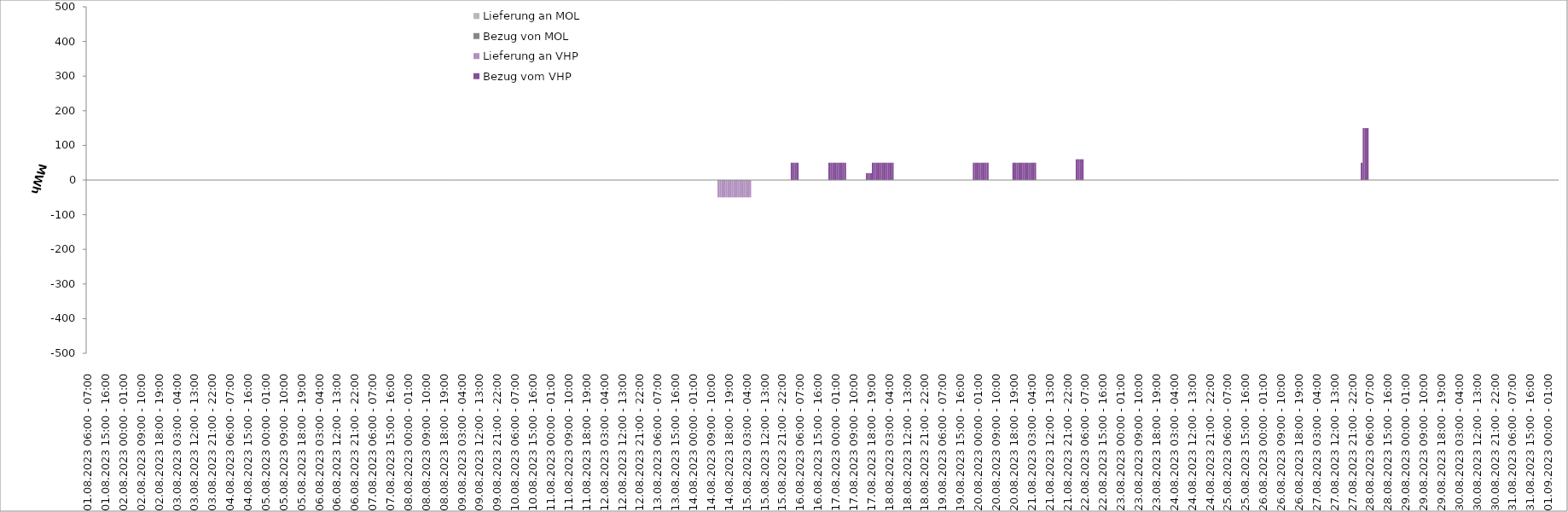
| Category | Bezug vom VHP | Lieferung an VHP | Bezug von MOL | Lieferung an MOL |
|---|---|---|---|---|
| 01.08.2023 06:00 - 07:00 | 0 | 0 | 0 | 0 |
| 01.08.2023 07:00 - 08:00 | 0 | 0 | 0 | 0 |
| 01.08.2023 08:00 - 09:00 | 0 | 0 | 0 | 0 |
| 01.08.2023 09:00 - 10:00 | 0 | 0 | 0 | 0 |
| 01.08.2023 10:00 - 11:00 | 0 | 0 | 0 | 0 |
| 01.08.2023 11:00 - 12:00 | 0 | 0 | 0 | 0 |
| 01.08.2023 12:00 - 13:00 | 0 | 0 | 0 | 0 |
| 01.08.2023 13:00 - 14:00 | 0 | 0 | 0 | 0 |
| 01.08.2023 14:00 - 15:00 | 0 | 0 | 0 | 0 |
| 01.08.2023 15:00 - 16:00 | 0 | 0 | 0 | 0 |
| 01.08.2023 16:00 - 17:00 | 0 | 0 | 0 | 0 |
| 01.08.2023 17:00 - 18:00 | 0 | 0 | 0 | 0 |
| 01.08.2023 18:00 - 19:00 | 0 | 0 | 0 | 0 |
| 01.08.2023 19:00 - 20:00 | 0 | 0 | 0 | 0 |
| 01.08.2023 20:00 - 21:00 | 0 | 0 | 0 | 0 |
| 01.08.2023 21:00 - 22:00 | 0 | 0 | 0 | 0 |
| 01.08.2023 22:00 - 23:00 | 0 | 0 | 0 | 0 |
| 01.08.2023 23:00 - 24:00 | 0 | 0 | 0 | 0 |
| 02.08.2023 00:00 - 01:00 | 0 | 0 | 0 | 0 |
| 02.08.2023 01:00 - 02:00 | 0 | 0 | 0 | 0 |
| 02.08.2023 02:00 - 03:00 | 0 | 0 | 0 | 0 |
| 02.08.2023 03:00 - 04:00 | 0 | 0 | 0 | 0 |
| 02.08.2023 04:00 - 05:00 | 0 | 0 | 0 | 0 |
| 02.08.2023 05:00 - 06:00 | 0 | 0 | 0 | 0 |
| 02.08.2023 06:00 - 07:00 | 0 | 0 | 0 | 0 |
| 02.08.2023 07:00 - 08:00 | 0 | 0 | 0 | 0 |
| 02.08.2023 08:00 - 09:00 | 0 | 0 | 0 | 0 |
| 02.08.2023 09:00 - 10:00 | 0 | 0 | 0 | 0 |
| 02.08.2023 10:00 - 11:00 | 0 | 0 | 0 | 0 |
| 02.08.2023 11:00 - 12:00 | 0 | 0 | 0 | 0 |
| 02.08.2023 12:00 - 13:00 | 0 | 0 | 0 | 0 |
| 02.08.2023 13:00 - 14:00 | 0 | 0 | 0 | 0 |
| 02.08.2023 14:00 - 15:00 | 0 | 0 | 0 | 0 |
| 02.08.2023 15:00 - 16:00 | 0 | 0 | 0 | 0 |
| 02.08.2023 16:00 - 17:00 | 0 | 0 | 0 | 0 |
| 02.08.2023 17:00 - 18:00 | 0 | 0 | 0 | 0 |
| 02.08.2023 18:00 - 19:00 | 0 | 0 | 0 | 0 |
| 02.08.2023 19:00 - 20:00 | 0 | 0 | 0 | 0 |
| 02.08.2023 20:00 - 21:00 | 0 | 0 | 0 | 0 |
| 02.08.2023 21:00 - 22:00 | 0 | 0 | 0 | 0 |
| 02.08.2023 22:00 - 23:00 | 0 | 0 | 0 | 0 |
| 02.08.2023 23:00 - 24:00 | 0 | 0 | 0 | 0 |
| 03.08.2023 00:00 - 01:00 | 0 | 0 | 0 | 0 |
| 03.08.2023 01:00 - 02:00 | 0 | 0 | 0 | 0 |
| 03.08.2023 02:00 - 03:00 | 0 | 0 | 0 | 0 |
| 03.08.2023 03:00 - 04:00 | 0 | 0 | 0 | 0 |
| 03.08.2023 04:00 - 05:00 | 0 | 0 | 0 | 0 |
| 03.08.2023 05:00 - 06:00 | 0 | 0 | 0 | 0 |
| 03.08.2023 06:00 - 07:00 | 0 | 0 | 0 | 0 |
| 03.08.2023 07:00 - 08:00 | 0 | 0 | 0 | 0 |
| 03.08.2023 08:00 - 09:00 | 0 | 0 | 0 | 0 |
| 03.08.2023 09:00 - 10:00 | 0 | 0 | 0 | 0 |
| 03.08.2023 10:00 - 11:00 | 0 | 0 | 0 | 0 |
| 03.08.2023 11:00 - 12:00 | 0 | 0 | 0 | 0 |
| 03.08.2023 12:00 - 13:00 | 0 | 0 | 0 | 0 |
| 03.08.2023 13:00 - 14:00 | 0 | 0 | 0 | 0 |
| 03.08.2023 14:00 - 15:00 | 0 | 0 | 0 | 0 |
| 03.08.2023 15:00 - 16:00 | 0 | 0 | 0 | 0 |
| 03.08.2023 16:00 - 17:00 | 0 | 0 | 0 | 0 |
| 03.08.2023 17:00 - 18:00 | 0 | 0 | 0 | 0 |
| 03.08.2023 18:00 - 19:00 | 0 | 0 | 0 | 0 |
| 03.08.2023 19:00 - 20:00 | 0 | 0 | 0 | 0 |
| 03.08.2023 20:00 - 21:00 | 0 | 0 | 0 | 0 |
| 03.08.2023 21:00 - 22:00 | 0 | 0 | 0 | 0 |
| 03.08.2023 22:00 - 23:00 | 0 | 0 | 0 | 0 |
| 03.08.2023 23:00 - 24:00 | 0 | 0 | 0 | 0 |
| 04.08.2023 00:00 - 01:00 | 0 | 0 | 0 | 0 |
| 04.08.2023 01:00 - 02:00 | 0 | 0 | 0 | 0 |
| 04.08.2023 02:00 - 03:00 | 0 | 0 | 0 | 0 |
| 04.08.2023 03:00 - 04:00 | 0 | 0 | 0 | 0 |
| 04.08.2023 04:00 - 05:00 | 0 | 0 | 0 | 0 |
| 04.08.2023 05:00 - 06:00 | 0 | 0 | 0 | 0 |
| 04.08.2023 06:00 - 07:00 | 0 | 0 | 0 | 0 |
| 04.08.2023 07:00 - 08:00 | 0 | 0 | 0 | 0 |
| 04.08.2023 08:00 - 09:00 | 0 | 0 | 0 | 0 |
| 04.08.2023 09:00 - 10:00 | 0 | 0 | 0 | 0 |
| 04.08.2023 10:00 - 11:00 | 0 | 0 | 0 | 0 |
| 04.08.2023 11:00 - 12:00 | 0 | 0 | 0 | 0 |
| 04.08.2023 12:00 - 13:00 | 0 | 0 | 0 | 0 |
| 04.08.2023 13:00 - 14:00 | 0 | 0 | 0 | 0 |
| 04.08.2023 14:00 - 15:00 | 0 | 0 | 0 | 0 |
| 04.08.2023 15:00 - 16:00 | 0 | 0 | 0 | 0 |
| 04.08.2023 16:00 - 17:00 | 0 | 0 | 0 | 0 |
| 04.08.2023 17:00 - 18:00 | 0 | 0 | 0 | 0 |
| 04.08.2023 18:00 - 19:00 | 0 | 0 | 0 | 0 |
| 04.08.2023 19:00 - 20:00 | 0 | 0 | 0 | 0 |
| 04.08.2023 20:00 - 21:00 | 0 | 0 | 0 | 0 |
| 04.08.2023 21:00 - 22:00 | 0 | 0 | 0 | 0 |
| 04.08.2023 22:00 - 23:00 | 0 | 0 | 0 | 0 |
| 04.08.2023 23:00 - 24:00 | 0 | 0 | 0 | 0 |
| 05.08.2023 00:00 - 01:00 | 0 | 0 | 0 | 0 |
| 05.08.2023 01:00 - 02:00 | 0 | 0 | 0 | 0 |
| 05.08.2023 02:00 - 03:00 | 0 | 0 | 0 | 0 |
| 05.08.2023 03:00 - 04:00 | 0 | 0 | 0 | 0 |
| 05.08.2023 04:00 - 05:00 | 0 | 0 | 0 | 0 |
| 05.08.2023 05:00 - 06:00 | 0 | 0 | 0 | 0 |
| 05.08.2023 06:00 - 07:00 | 0 | 0 | 0 | 0 |
| 05.08.2023 07:00 - 08:00 | 0 | 0 | 0 | 0 |
| 05.08.2023 08:00 - 09:00 | 0 | 0 | 0 | 0 |
| 05.08.2023 09:00 - 10:00 | 0 | 0 | 0 | 0 |
| 05.08.2023 10:00 - 11:00 | 0 | 0 | 0 | 0 |
| 05.08.2023 11:00 - 12:00 | 0 | 0 | 0 | 0 |
| 05.08.2023 12:00 - 13:00 | 0 | 0 | 0 | 0 |
| 05.08.2023 13:00 - 14:00 | 0 | 0 | 0 | 0 |
| 05.08.2023 14:00 - 15:00 | 0 | 0 | 0 | 0 |
| 05.08.2023 15:00 - 16:00 | 0 | 0 | 0 | 0 |
| 05.08.2023 16:00 - 17:00 | 0 | 0 | 0 | 0 |
| 05.08.2023 17:00 - 18:00 | 0 | 0 | 0 | 0 |
| 05.08.2023 18:00 - 19:00 | 0 | 0 | 0 | 0 |
| 05.08.2023 19:00 - 20:00 | 0 | 0 | 0 | 0 |
| 05.08.2023 20:00 - 21:00 | 0 | 0 | 0 | 0 |
| 05.08.2023 21:00 - 22:00 | 0 | 0 | 0 | 0 |
| 05.08.2023 22:00 - 23:00 | 0 | 0 | 0 | 0 |
| 05.08.2023 23:00 - 24:00 | 0 | 0 | 0 | 0 |
| 06.08.2023 00:00 - 01:00 | 0 | 0 | 0 | 0 |
| 06.08.2023 01:00 - 02:00 | 0 | 0 | 0 | 0 |
| 06.08.2023 02:00 - 03:00 | 0 | 0 | 0 | 0 |
| 06.08.2023 03:00 - 04:00 | 0 | 0 | 0 | 0 |
| 06.08.2023 04:00 - 05:00 | 0 | 0 | 0 | 0 |
| 06.08.2023 05:00 - 06:00 | 0 | 0 | 0 | 0 |
| 06.08.2023 06:00 - 07:00 | 0 | 0 | 0 | 0 |
| 06.08.2023 07:00 - 08:00 | 0 | 0 | 0 | 0 |
| 06.08.2023 08:00 - 09:00 | 0 | 0 | 0 | 0 |
| 06.08.2023 09:00 - 10:00 | 0 | 0 | 0 | 0 |
| 06.08.2023 10:00 - 11:00 | 0 | 0 | 0 | 0 |
| 06.08.2023 11:00 - 12:00 | 0 | 0 | 0 | 0 |
| 06.08.2023 12:00 - 13:00 | 0 | 0 | 0 | 0 |
| 06.08.2023 13:00 - 14:00 | 0 | 0 | 0 | 0 |
| 06.08.2023 14:00 - 15:00 | 0 | 0 | 0 | 0 |
| 06.08.2023 15:00 - 16:00 | 0 | 0 | 0 | 0 |
| 06.08.2023 16:00 - 17:00 | 0 | 0 | 0 | 0 |
| 06.08.2023 17:00 - 18:00 | 0 | 0 | 0 | 0 |
| 06.08.2023 18:00 - 19:00 | 0 | 0 | 0 | 0 |
| 06.08.2023 19:00 - 20:00 | 0 | 0 | 0 | 0 |
| 06.08.2023 20:00 - 21:00 | 0 | 0 | 0 | 0 |
| 06.08.2023 21:00 - 22:00 | 0 | 0 | 0 | 0 |
| 06.08.2023 22:00 - 23:00 | 0 | 0 | 0 | 0 |
| 06.08.2023 23:00 - 24:00 | 0 | 0 | 0 | 0 |
| 07.08.2023 00:00 - 01:00 | 0 | 0 | 0 | 0 |
| 07.08.2023 01:00 - 02:00 | 0 | 0 | 0 | 0 |
| 07.08.2023 02:00 - 03:00 | 0 | 0 | 0 | 0 |
| 07.08.2023 03:00 - 04:00 | 0 | 0 | 0 | 0 |
| 07.08.2023 04:00 - 05:00 | 0 | 0 | 0 | 0 |
| 07.08.2023 05:00 - 06:00 | 0 | 0 | 0 | 0 |
| 07.08.2023 06:00 - 07:00 | 0 | 0 | 0 | 0 |
| 07.08.2023 07:00 - 08:00 | 0 | 0 | 0 | 0 |
| 07.08.2023 08:00 - 09:00 | 0 | 0 | 0 | 0 |
| 07.08.2023 09:00 - 10:00 | 0 | 0 | 0 | 0 |
| 07.08.2023 10:00 - 11:00 | 0 | 0 | 0 | 0 |
| 07.08.2023 11:00 - 12:00 | 0 | 0 | 0 | 0 |
| 07.08.2023 12:00 - 13:00 | 0 | 0 | 0 | 0 |
| 07.08.2023 13:00 - 14:00 | 0 | 0 | 0 | 0 |
| 07.08.2023 14:00 - 15:00 | 0 | 0 | 0 | 0 |
| 07.08.2023 15:00 - 16:00 | 0 | 0 | 0 | 0 |
| 07.08.2023 16:00 - 17:00 | 0 | 0 | 0 | 0 |
| 07.08.2023 17:00 - 18:00 | 0 | 0 | 0 | 0 |
| 07.08.2023 18:00 - 19:00 | 0 | 0 | 0 | 0 |
| 07.08.2023 19:00 - 20:00 | 0 | 0 | 0 | 0 |
| 07.08.2023 20:00 - 21:00 | 0 | 0 | 0 | 0 |
| 07.08.2023 21:00 - 22:00 | 0 | 0 | 0 | 0 |
| 07.08.2023 22:00 - 23:00 | 0 | 0 | 0 | 0 |
| 07.08.2023 23:00 - 24:00 | 0 | 0 | 0 | 0 |
| 08.08.2023 00:00 - 01:00 | 0 | 0 | 0 | 0 |
| 08.08.2023 01:00 - 02:00 | 0 | 0 | 0 | 0 |
| 08.08.2023 02:00 - 03:00 | 0 | 0 | 0 | 0 |
| 08.08.2023 03:00 - 04:00 | 0 | 0 | 0 | 0 |
| 08.08.2023 04:00 - 05:00 | 0 | 0 | 0 | 0 |
| 08.08.2023 05:00 - 06:00 | 0 | 0 | 0 | 0 |
| 08.08.2023 06:00 - 07:00 | 0 | 0 | 0 | 0 |
| 08.08.2023 07:00 - 08:00 | 0 | 0 | 0 | 0 |
| 08.08.2023 08:00 - 09:00 | 0 | 0 | 0 | 0 |
| 08.08.2023 09:00 - 10:00 | 0 | 0 | 0 | 0 |
| 08.08.2023 10:00 - 11:00 | 0 | 0 | 0 | 0 |
| 08.08.2023 11:00 - 12:00 | 0 | 0 | 0 | 0 |
| 08.08.2023 12:00 - 13:00 | 0 | 0 | 0 | 0 |
| 08.08.2023 13:00 - 14:00 | 0 | 0 | 0 | 0 |
| 08.08.2023 14:00 - 15:00 | 0 | 0 | 0 | 0 |
| 08.08.2023 15:00 - 16:00 | 0 | 0 | 0 | 0 |
| 08.08.2023 16:00 - 17:00 | 0 | 0 | 0 | 0 |
| 08.08.2023 17:00 - 18:00 | 0 | 0 | 0 | 0 |
| 08.08.2023 18:00 - 19:00 | 0 | 0 | 0 | 0 |
| 08.08.2023 19:00 - 20:00 | 0 | 0 | 0 | 0 |
| 08.08.2023 20:00 - 21:00 | 0 | 0 | 0 | 0 |
| 08.08.2023 21:00 - 22:00 | 0 | 0 | 0 | 0 |
| 08.08.2023 22:00 - 23:00 | 0 | 0 | 0 | 0 |
| 08.08.2023 23:00 - 24:00 | 0 | 0 | 0 | 0 |
| 09.08.2023 00:00 - 01:00 | 0 | 0 | 0 | 0 |
| 09.08.2023 01:00 - 02:00 | 0 | 0 | 0 | 0 |
| 09.08.2023 02:00 - 03:00 | 0 | 0 | 0 | 0 |
| 09.08.2023 03:00 - 04:00 | 0 | 0 | 0 | 0 |
| 09.08.2023 04:00 - 05:00 | 0 | 0 | 0 | 0 |
| 09.08.2023 05:00 - 06:00 | 0 | 0 | 0 | 0 |
| 09.08.2023 06:00 - 07:00 | 0 | 0 | 0 | 0 |
| 09.08.2023 07:00 - 08:00 | 0 | 0 | 0 | 0 |
| 09.08.2023 08:00 - 09:00 | 0 | 0 | 0 | 0 |
| 09.08.2023 09:00 - 10:00 | 0 | 0 | 0 | 0 |
| 09.08.2023 10:00 - 11:00 | 0 | 0 | 0 | 0 |
| 09.08.2023 11:00 - 12:00 | 0 | 0 | 0 | 0 |
| 09.08.2023 12:00 - 13:00 | 0 | 0 | 0 | 0 |
| 09.08.2023 13:00 - 14:00 | 0 | 0 | 0 | 0 |
| 09.08.2023 14:00 - 15:00 | 0 | 0 | 0 | 0 |
| 09.08.2023 15:00 - 16:00 | 0 | 0 | 0 | 0 |
| 09.08.2023 16:00 - 17:00 | 0 | 0 | 0 | 0 |
| 09.08.2023 17:00 - 18:00 | 0 | 0 | 0 | 0 |
| 09.08.2023 18:00 - 19:00 | 0 | 0 | 0 | 0 |
| 09.08.2023 19:00 - 20:00 | 0 | 0 | 0 | 0 |
| 09.08.2023 20:00 - 21:00 | 0 | 0 | 0 | 0 |
| 09.08.2023 21:00 - 22:00 | 0 | 0 | 0 | 0 |
| 09.08.2023 22:00 - 23:00 | 0 | 0 | 0 | 0 |
| 09.08.2023 23:00 - 24:00 | 0 | 0 | 0 | 0 |
| 10.08.2023 00:00 - 01:00 | 0 | 0 | 0 | 0 |
| 10.08.2023 01:00 - 02:00 | 0 | 0 | 0 | 0 |
| 10.08.2023 02:00 - 03:00 | 0 | 0 | 0 | 0 |
| 10.08.2023 03:00 - 04:00 | 0 | 0 | 0 | 0 |
| 10.08.2023 04:00 - 05:00 | 0 | 0 | 0 | 0 |
| 10.08.2023 05:00 - 06:00 | 0 | 0 | 0 | 0 |
| 10.08.2023 06:00 - 07:00 | 0 | 0 | 0 | 0 |
| 10.08.2023 07:00 - 08:00 | 0 | 0 | 0 | 0 |
| 10.08.2023 08:00 - 09:00 | 0 | 0 | 0 | 0 |
| 10.08.2023 09:00 - 10:00 | 0 | 0 | 0 | 0 |
| 10.08.2023 10:00 - 11:00 | 0 | 0 | 0 | 0 |
| 10.08.2023 11:00 - 12:00 | 0 | 0 | 0 | 0 |
| 10.08.2023 12:00 - 13:00 | 0 | 0 | 0 | 0 |
| 10.08.2023 13:00 - 14:00 | 0 | 0 | 0 | 0 |
| 10.08.2023 14:00 - 15:00 | 0 | 0 | 0 | 0 |
| 10.08.2023 15:00 - 16:00 | 0 | 0 | 0 | 0 |
| 10.08.2023 16:00 - 17:00 | 0 | 0 | 0 | 0 |
| 10.08.2023 17:00 - 18:00 | 0 | 0 | 0 | 0 |
| 10.08.2023 18:00 - 19:00 | 0 | 0 | 0 | 0 |
| 10.08.2023 19:00 - 20:00 | 0 | 0 | 0 | 0 |
| 10.08.2023 20:00 - 21:00 | 0 | 0 | 0 | 0 |
| 10.08.2023 21:00 - 22:00 | 0 | 0 | 0 | 0 |
| 10.08.2023 22:00 - 23:00 | 0 | 0 | 0 | 0 |
| 10.08.2023 23:00 - 24:00 | 0 | 0 | 0 | 0 |
| 11.08.2023 00:00 - 01:00 | 0 | 0 | 0 | 0 |
| 11.08.2023 01:00 - 02:00 | 0 | 0 | 0 | 0 |
| 11.08.2023 02:00 - 03:00 | 0 | 0 | 0 | 0 |
| 11.08.2023 03:00 - 04:00 | 0 | 0 | 0 | 0 |
| 11.08.2023 04:00 - 05:00 | 0 | 0 | 0 | 0 |
| 11.08.2023 05:00 - 06:00 | 0 | 0 | 0 | 0 |
| 11.08.2023 06:00 - 07:00 | 0 | 0 | 0 | 0 |
| 11.08.2023 07:00 - 08:00 | 0 | 0 | 0 | 0 |
| 11.08.2023 08:00 - 09:00 | 0 | 0 | 0 | 0 |
| 11.08.2023 09:00 - 10:00 | 0 | 0 | 0 | 0 |
| 11.08.2023 10:00 - 11:00 | 0 | 0 | 0 | 0 |
| 11.08.2023 11:00 - 12:00 | 0 | 0 | 0 | 0 |
| 11.08.2023 12:00 - 13:00 | 0 | 0 | 0 | 0 |
| 11.08.2023 13:00 - 14:00 | 0 | 0 | 0 | 0 |
| 11.08.2023 14:00 - 15:00 | 0 | 0 | 0 | 0 |
| 11.08.2023 15:00 - 16:00 | 0 | 0 | 0 | 0 |
| 11.08.2023 16:00 - 17:00 | 0 | 0 | 0 | 0 |
| 11.08.2023 17:00 - 18:00 | 0 | 0 | 0 | 0 |
| 11.08.2023 18:00 - 19:00 | 0 | 0 | 0 | 0 |
| 11.08.2023 19:00 - 20:00 | 0 | 0 | 0 | 0 |
| 11.08.2023 20:00 - 21:00 | 0 | 0 | 0 | 0 |
| 11.08.2023 21:00 - 22:00 | 0 | 0 | 0 | 0 |
| 11.08.2023 22:00 - 23:00 | 0 | 0 | 0 | 0 |
| 11.08.2023 23:00 - 24:00 | 0 | 0 | 0 | 0 |
| 12.08.2023 00:00 - 01:00 | 0 | 0 | 0 | 0 |
| 12.08.2023 01:00 - 02:00 | 0 | 0 | 0 | 0 |
| 12.08.2023 02:00 - 03:00 | 0 | 0 | 0 | 0 |
| 12.08.2023 03:00 - 04:00 | 0 | 0 | 0 | 0 |
| 12.08.2023 04:00 - 05:00 | 0 | 0 | 0 | 0 |
| 12.08.2023 05:00 - 06:00 | 0 | 0 | 0 | 0 |
| 12.08.2023 06:00 - 07:00 | 0 | 0 | 0 | 0 |
| 12.08.2023 07:00 - 08:00 | 0 | 0 | 0 | 0 |
| 12.08.2023 08:00 - 09:00 | 0 | 0 | 0 | 0 |
| 12.08.2023 09:00 - 10:00 | 0 | 0 | 0 | 0 |
| 12.08.2023 10:00 - 11:00 | 0 | 0 | 0 | 0 |
| 12.08.2023 11:00 - 12:00 | 0 | 0 | 0 | 0 |
| 12.08.2023 12:00 - 13:00 | 0 | 0 | 0 | 0 |
| 12.08.2023 13:00 - 14:00 | 0 | 0 | 0 | 0 |
| 12.08.2023 14:00 - 15:00 | 0 | 0 | 0 | 0 |
| 12.08.2023 15:00 - 16:00 | 0 | 0 | 0 | 0 |
| 12.08.2023 16:00 - 17:00 | 0 | 0 | 0 | 0 |
| 12.08.2023 17:00 - 18:00 | 0 | 0 | 0 | 0 |
| 12.08.2023 18:00 - 19:00 | 0 | 0 | 0 | 0 |
| 12.08.2023 19:00 - 20:00 | 0 | 0 | 0 | 0 |
| 12.08.2023 20:00 - 21:00 | 0 | 0 | 0 | 0 |
| 12.08.2023 21:00 - 22:00 | 0 | 0 | 0 | 0 |
| 12.08.2023 22:00 - 23:00 | 0 | 0 | 0 | 0 |
| 12.08.2023 23:00 - 24:00 | 0 | 0 | 0 | 0 |
| 13.08.2023 00:00 - 01:00 | 0 | 0 | 0 | 0 |
| 13.08.2023 01:00 - 02:00 | 0 | 0 | 0 | 0 |
| 13.08.2023 02:00 - 03:00 | 0 | 0 | 0 | 0 |
| 13.08.2023 03:00 - 04:00 | 0 | 0 | 0 | 0 |
| 13.08.2023 04:00 - 05:00 | 0 | 0 | 0 | 0 |
| 13.08.2023 05:00 - 06:00 | 0 | 0 | 0 | 0 |
| 13.08.2023 06:00 - 07:00 | 0 | 0 | 0 | 0 |
| 13.08.2023 07:00 - 08:00 | 0 | 0 | 0 | 0 |
| 13.08.2023 08:00 - 09:00 | 0 | 0 | 0 | 0 |
| 13.08.2023 09:00 - 10:00 | 0 | 0 | 0 | 0 |
| 13.08.2023 10:00 - 11:00 | 0 | 0 | 0 | 0 |
| 13.08.2023 11:00 - 12:00 | 0 | 0 | 0 | 0 |
| 13.08.2023 12:00 - 13:00 | 0 | 0 | 0 | 0 |
| 13.08.2023 13:00 - 14:00 | 0 | 0 | 0 | 0 |
| 13.08.2023 14:00 - 15:00 | 0 | 0 | 0 | 0 |
| 13.08.2023 15:00 - 16:00 | 0 | 0 | 0 | 0 |
| 13.08.2023 16:00 - 17:00 | 0 | 0 | 0 | 0 |
| 13.08.2023 17:00 - 18:00 | 0 | 0 | 0 | 0 |
| 13.08.2023 18:00 - 19:00 | 0 | 0 | 0 | 0 |
| 13.08.2023 19:00 - 20:00 | 0 | 0 | 0 | 0 |
| 13.08.2023 20:00 - 21:00 | 0 | 0 | 0 | 0 |
| 13.08.2023 21:00 - 22:00 | 0 | 0 | 0 | 0 |
| 13.08.2023 22:00 - 23:00 | 0 | 0 | 0 | 0 |
| 13.08.2023 23:00 - 24:00 | 0 | 0 | 0 | 0 |
| 14.08.2023 00:00 - 01:00 | 0 | 0 | 0 | 0 |
| 14.08.2023 01:00 - 02:00 | 0 | 0 | 0 | 0 |
| 14.08.2023 02:00 - 03:00 | 0 | 0 | 0 | 0 |
| 14.08.2023 03:00 - 04:00 | 0 | 0 | 0 | 0 |
| 14.08.2023 04:00 - 05:00 | 0 | 0 | 0 | 0 |
| 14.08.2023 05:00 - 06:00 | 0 | 0 | 0 | 0 |
| 14.08.2023 06:00 - 07:00 | 0 | 0 | 0 | 0 |
| 14.08.2023 07:00 - 08:00 | 0 | 0 | 0 | 0 |
| 14.08.2023 08:00 - 09:00 | 0 | 0 | 0 | 0 |
| 14.08.2023 09:00 - 10:00 | 0 | 0 | 0 | 0 |
| 14.08.2023 10:00 - 11:00 | 0 | 0 | 0 | 0 |
| 14.08.2023 11:00 - 12:00 | 0 | 0 | 0 | 0 |
| 14.08.2023 12:00 - 13:00 | 0 | 0 | 0 | 0 |
| 14.08.2023 13:00 - 14:00 | 0 | -50 | 0 | 0 |
| 14.08.2023 14:00 - 15:00 | 0 | -50 | 0 | 0 |
| 14.08.2023 15:00 - 16:00 | 0 | -50 | 0 | 0 |
| 14.08.2023 16:00 - 17:00 | 0 | -50 | 0 | 0 |
| 14.08.2023 17:00 - 18:00 | 0 | -50 | 0 | 0 |
| 14.08.2023 18:00 - 19:00 | 0 | -50 | 0 | 0 |
| 14.08.2023 19:00 - 20:00 | 0 | -50 | 0 | 0 |
| 14.08.2023 20:00 - 21:00 | 0 | -50 | 0 | 0 |
| 14.08.2023 21:00 - 22:00 | 0 | -50 | 0 | 0 |
| 14.08.2023 22:00 - 23:00 | 0 | -50 | 0 | 0 |
| 14.08.2023 23:00 - 24:00 | 0 | -50 | 0 | 0 |
| 15.08.2023 00:00 - 01:00 | 0 | -50 | 0 | 0 |
| 15.08.2023 01:00 - 02:00 | 0 | -50 | 0 | 0 |
| 15.08.2023 02:00 - 03:00 | 0 | -50 | 0 | 0 |
| 15.08.2023 03:00 - 04:00 | 0 | -50 | 0 | 0 |
| 15.08.2023 04:00 - 05:00 | 0 | -50 | 0 | 0 |
| 15.08.2023 05:00 - 06:00 | 0 | -50 | 0 | 0 |
| 15.08.2023 06:00 - 07:00 | 0 | 0 | 0 | 0 |
| 15.08.2023 07:00 - 08:00 | 0 | 0 | 0 | 0 |
| 15.08.2023 08:00 - 09:00 | 0 | 0 | 0 | 0 |
| 15.08.2023 09:00 - 10:00 | 0 | 0 | 0 | 0 |
| 15.08.2023 10:00 - 11:00 | 0 | 0 | 0 | 0 |
| 15.08.2023 11:00 - 12:00 | 0 | 0 | 0 | 0 |
| 15.08.2023 12:00 - 13:00 | 0 | 0 | 0 | 0 |
| 15.08.2023 13:00 - 14:00 | 0 | 0 | 0 | 0 |
| 15.08.2023 14:00 - 15:00 | 0 | 0 | 0 | 0 |
| 15.08.2023 15:00 - 16:00 | 0 | 0 | 0 | 0 |
| 15.08.2023 16:00 - 17:00 | 0 | 0 | 0 | 0 |
| 15.08.2023 17:00 - 18:00 | 0 | 0 | 0 | 0 |
| 15.08.2023 18:00 - 19:00 | 0 | 0 | 0 | 0 |
| 15.08.2023 19:00 - 20:00 | 0 | 0 | 0 | 0 |
| 15.08.2023 20:00 - 21:00 | 0 | 0 | 0 | 0 |
| 15.08.2023 21:00 - 22:00 | 0 | 0 | 0 | 0 |
| 15.08.2023 22:00 - 23:00 | 0 | 0 | 0 | 0 |
| 15.08.2023 23:00 - 24:00 | 0 | 0 | 0 | 0 |
| 16.08.2023 00:00 - 01:00 | 0 | 0 | 0 | 0 |
| 16.08.2023 01:00 - 02:00 | 0 | 0 | 0 | 0 |
| 16.08.2023 02:00 - 03:00 | 50 | 0 | 0 | 0 |
| 16.08.2023 03:00 - 04:00 | 50 | 0 | 0 | 0 |
| 16.08.2023 04:00 - 05:00 | 50 | 0 | 0 | 0 |
| 16.08.2023 05:00 - 06:00 | 50 | 0 | 0 | 0 |
| 16.08.2023 06:00 - 07:00 | 0 | 0 | 0 | 0 |
| 16.08.2023 07:00 - 08:00 | 0 | 0 | 0 | 0 |
| 16.08.2023 08:00 - 09:00 | 0 | 0 | 0 | 0 |
| 16.08.2023 09:00 - 10:00 | 0 | 0 | 0 | 0 |
| 16.08.2023 10:00 - 11:00 | 0 | 0 | 0 | 0 |
| 16.08.2023 11:00 - 12:00 | 0 | 0 | 0 | 0 |
| 16.08.2023 12:00 - 13:00 | 0 | 0 | 0 | 0 |
| 16.08.2023 13:00 - 14:00 | 0 | 0 | 0 | 0 |
| 16.08.2023 14:00 - 15:00 | 0 | 0 | 0 | 0 |
| 16.08.2023 15:00 - 16:00 | 0 | 0 | 0 | 0 |
| 16.08.2023 16:00 - 17:00 | 0 | 0 | 0 | 0 |
| 16.08.2023 17:00 - 18:00 | 0 | 0 | 0 | 0 |
| 16.08.2023 18:00 - 19:00 | 0 | 0 | 0 | 0 |
| 16.08.2023 19:00 - 20:00 | 0 | 0 | 0 | 0 |
| 16.08.2023 20:00 - 21:00 | 0 | 0 | 0 | 0 |
| 16.08.2023 21:00 - 22:00 | 50 | 0 | 0 | 0 |
| 16.08.2023 22:00 - 23:00 | 50 | 0 | 0 | 0 |
| 16.08.2023 23:00 - 24:00 | 50 | 0 | 0 | 0 |
| 17.08.2023 00:00 - 01:00 | 50 | 0 | 0 | 0 |
| 17.08.2023 01:00 - 02:00 | 50 | 0 | 0 | 0 |
| 17.08.2023 02:00 - 03:00 | 50 | 0 | 0 | 0 |
| 17.08.2023 03:00 - 04:00 | 50 | 0 | 0 | 0 |
| 17.08.2023 04:00 - 05:00 | 50 | 0 | 0 | 0 |
| 17.08.2023 05:00 - 06:00 | 50 | 0 | 0 | 0 |
| 17.08.2023 06:00 - 07:00 | 0 | 0 | 0 | 0 |
| 17.08.2023 07:00 - 08:00 | 0 | 0 | 0 | 0 |
| 17.08.2023 08:00 - 09:00 | 0 | 0 | 0 | 0 |
| 17.08.2023 09:00 - 10:00 | 0 | 0 | 0 | 0 |
| 17.08.2023 10:00 - 11:00 | 0 | 0 | 0 | 0 |
| 17.08.2023 11:00 - 12:00 | 0 | 0 | 0 | 0 |
| 17.08.2023 12:00 - 13:00 | 0 | 0 | 0 | 0 |
| 17.08.2023 13:00 - 14:00 | 0 | 0 | 0 | 0 |
| 17.08.2023 14:00 - 15:00 | 0 | 0 | 0 | 0 |
| 17.08.2023 15:00 - 16:00 | 0 | 0 | 0 | 0 |
| 17.08.2023 16:00 - 17:00 | 20 | 0 | 0 | 0 |
| 17.08.2023 17:00 - 18:00 | 20 | 0 | 0 | 0 |
| 17.08.2023 18:00 - 19:00 | 20 | 0 | 0 | 0 |
| 17.08.2023 19:00 - 20:00 | 50 | 0 | 0 | 0 |
| 17.08.2023 20:00 - 21:00 | 50 | 0 | 0 | 0 |
| 17.08.2023 21:00 - 22:00 | 50 | 0 | 0 | 0 |
| 17.08.2023 22:00 - 23:00 | 50 | 0 | 0 | 0 |
| 17.08.2023 23:00 - 24:00 | 50 | 0 | 0 | 0 |
| 18.08.2023 00:00 - 01:00 | 50 | 0 | 0 | 0 |
| 18.08.2023 01:00 - 02:00 | 50 | 0 | 0 | 0 |
| 18.08.2023 02:00 - 03:00 | 50 | 0 | 0 | 0 |
| 18.08.2023 03:00 - 04:00 | 50 | 0 | 0 | 0 |
| 18.08.2023 04:00 - 05:00 | 50 | 0 | 0 | 0 |
| 18.08.2023 05:00 - 06:00 | 50 | 0 | 0 | 0 |
| 18.08.2023 06:00 - 07:00 | 0 | 0 | 0 | 0 |
| 18.08.2023 07:00 - 08:00 | 0 | 0 | 0 | 0 |
| 18.08.2023 08:00 - 09:00 | 0 | 0 | 0 | 0 |
| 18.08.2023 09:00 - 10:00 | 0 | 0 | 0 | 0 |
| 18.08.2023 10:00 - 11:00 | 0 | 0 | 0 | 0 |
| 18.08.2023 11:00 - 12:00 | 0 | 0 | 0 | 0 |
| 18.08.2023 12:00 - 13:00 | 0 | 0 | 0 | 0 |
| 18.08.2023 13:00 - 14:00 | 0 | 0 | 0 | 0 |
| 18.08.2023 14:00 - 15:00 | 0 | 0 | 0 | 0 |
| 18.08.2023 15:00 - 16:00 | 0 | 0 | 0 | 0 |
| 18.08.2023 16:00 - 17:00 | 0 | 0 | 0 | 0 |
| 18.08.2023 17:00 - 18:00 | 0 | 0 | 0 | 0 |
| 18.08.2023 18:00 - 19:00 | 0 | 0 | 0 | 0 |
| 18.08.2023 19:00 - 20:00 | 0 | 0 | 0 | 0 |
| 18.08.2023 20:00 - 21:00 | 0 | 0 | 0 | 0 |
| 18.08.2023 21:00 - 22:00 | 0 | 0 | 0 | 0 |
| 18.08.2023 22:00 - 23:00 | 0 | 0 | 0 | 0 |
| 18.08.2023 23:00 - 24:00 | 0 | 0 | 0 | 0 |
| 19.08.2023 00:00 - 01:00 | 0 | 0 | 0 | 0 |
| 19.08.2023 01:00 - 02:00 | 0 | 0 | 0 | 0 |
| 19.08.2023 02:00 - 03:00 | 0 | 0 | 0 | 0 |
| 19.08.2023 03:00 - 04:00 | 0 | 0 | 0 | 0 |
| 19.08.2023 04:00 - 05:00 | 0 | 0 | 0 | 0 |
| 19.08.2023 05:00 - 06:00 | 0 | 0 | 0 | 0 |
| 19.08.2023 06:00 - 07:00 | 0 | 0 | 0 | 0 |
| 19.08.2023 07:00 - 08:00 | 0 | 0 | 0 | 0 |
| 19.08.2023 08:00 - 09:00 | 0 | 0 | 0 | 0 |
| 19.08.2023 09:00 - 10:00 | 0 | 0 | 0 | 0 |
| 19.08.2023 10:00 - 11:00 | 0 | 0 | 0 | 0 |
| 19.08.2023 11:00 - 12:00 | 0 | 0 | 0 | 0 |
| 19.08.2023 12:00 - 13:00 | 0 | 0 | 0 | 0 |
| 19.08.2023 13:00 - 14:00 | 0 | 0 | 0 | 0 |
| 19.08.2023 14:00 - 15:00 | 0 | 0 | 0 | 0 |
| 19.08.2023 15:00 - 16:00 | 0 | 0 | 0 | 0 |
| 19.08.2023 16:00 - 17:00 | 0 | 0 | 0 | 0 |
| 19.08.2023 17:00 - 18:00 | 0 | 0 | 0 | 0 |
| 19.08.2023 18:00 - 19:00 | 0 | 0 | 0 | 0 |
| 19.08.2023 19:00 - 20:00 | 0 | 0 | 0 | 0 |
| 19.08.2023 20:00 - 21:00 | 0 | 0 | 0 | 0 |
| 19.08.2023 21:00 - 22:00 | 0 | 0 | 0 | 0 |
| 19.08.2023 22:00 - 23:00 | 50 | 0 | 0 | 0 |
| 19.08.2023 23:00 - 24:00 | 50 | 0 | 0 | 0 |
| 20.08.2023 00:00 - 01:00 | 50 | 0 | 0 | 0 |
| 20.08.2023 01:00 - 02:00 | 50 | 0 | 0 | 0 |
| 20.08.2023 02:00 - 03:00 | 50 | 0 | 0 | 0 |
| 20.08.2023 03:00 - 04:00 | 50 | 0 | 0 | 0 |
| 20.08.2023 04:00 - 05:00 | 50 | 0 | 0 | 0 |
| 20.08.2023 05:00 - 06:00 | 50 | 0 | 0 | 0 |
| 20.08.2023 06:00 - 07:00 | 0 | 0 | 0 | 0 |
| 20.08.2023 07:00 - 08:00 | 0 | 0 | 0 | 0 |
| 20.08.2023 08:00 - 09:00 | 0 | 0 | 0 | 0 |
| 20.08.2023 09:00 - 10:00 | 0 | 0 | 0 | 0 |
| 20.08.2023 10:00 - 11:00 | 0 | 0 | 0 | 0 |
| 20.08.2023 11:00 - 12:00 | 0 | 0 | 0 | 0 |
| 20.08.2023 12:00 - 13:00 | 0 | 0 | 0 | 0 |
| 20.08.2023 13:00 - 14:00 | 0 | 0 | 0 | 0 |
| 20.08.2023 14:00 - 15:00 | 0 | 0 | 0 | 0 |
| 20.08.2023 15:00 - 16:00 | 0 | 0 | 0 | 0 |
| 20.08.2023 16:00 - 17:00 | 0 | 0 | 0 | 0 |
| 20.08.2023 17:00 - 18:00 | 0 | 0 | 0 | 0 |
| 20.08.2023 18:00 - 19:00 | 50 | 0 | 0 | 0 |
| 20.08.2023 19:00 - 20:00 | 50 | 0 | 0 | 0 |
| 20.08.2023 20:00 - 21:00 | 50 | 0 | 0 | 0 |
| 20.08.2023 21:00 - 22:00 | 50 | 0 | 0 | 0 |
| 20.08.2023 22:00 - 23:00 | 50 | 0 | 0 | 0 |
| 20.08.2023 23:00 - 24:00 | 50 | 0 | 0 | 0 |
| 21.08.2023 00:00 - 01:00 | 50 | 0 | 0 | 0 |
| 21.08.2023 01:00 - 02:00 | 50 | 0 | 0 | 0 |
| 21.08.2023 02:00 - 03:00 | 50 | 0 | 0 | 0 |
| 21.08.2023 03:00 - 04:00 | 50 | 0 | 0 | 0 |
| 21.08.2023 04:00 - 05:00 | 50 | 0 | 0 | 0 |
| 21.08.2023 05:00 - 06:00 | 50 | 0 | 0 | 0 |
| 21.08.2023 06:00 - 07:00 | 0 | 0 | 0 | 0 |
| 21.08.2023 07:00 - 08:00 | 0 | 0 | 0 | 0 |
| 21.08.2023 08:00 - 09:00 | 0 | 0 | 0 | 0 |
| 21.08.2023 09:00 - 10:00 | 0 | 0 | 0 | 0 |
| 21.08.2023 10:00 - 11:00 | 0 | 0 | 0 | 0 |
| 21.08.2023 11:00 - 12:00 | 0 | 0 | 0 | 0 |
| 21.08.2023 12:00 - 13:00 | 0 | 0 | 0 | 0 |
| 21.08.2023 13:00 - 14:00 | 0 | 0 | 0 | 0 |
| 21.08.2023 14:00 - 15:00 | 0 | 0 | 0 | 0 |
| 21.08.2023 15:00 - 16:00 | 0 | 0 | 0 | 0 |
| 21.08.2023 16:00 - 17:00 | 0 | 0 | 0 | 0 |
| 21.08.2023 17:00 - 18:00 | 0 | 0 | 0 | 0 |
| 21.08.2023 18:00 - 19:00 | 0 | 0 | 0 | 0 |
| 21.08.2023 19:00 - 20:00 | 0 | 0 | 0 | 0 |
| 21.08.2023 20:00 - 21:00 | 0 | 0 | 0 | 0 |
| 21.08.2023 21:00 - 22:00 | 0 | 0 | 0 | 0 |
| 21.08.2023 22:00 - 23:00 | 0 | 0 | 0 | 0 |
| 21.08.2023 23:00 - 24:00 | 0 | 0 | 0 | 0 |
| 22.08.2023 00:00 - 01:00 | 0 | 0 | 0 | 0 |
| 22.08.2023 01:00 - 02:00 | 0 | 0 | 0 | 0 |
| 22.08.2023 02:00 - 03:00 | 60 | 0 | 0 | 0 |
| 22.08.2023 03:00 - 04:00 | 60 | 0 | 0 | 0 |
| 22.08.2023 04:00 - 05:00 | 60 | 0 | 0 | 0 |
| 22.08.2023 05:00 - 06:00 | 60 | 0 | 0 | 0 |
| 22.08.2023 06:00 - 07:00 | 0 | 0 | 0 | 0 |
| 22.08.2023 07:00 - 08:00 | 0 | 0 | 0 | 0 |
| 22.08.2023 08:00 - 09:00 | 0 | 0 | 0 | 0 |
| 22.08.2023 09:00 - 10:00 | 0 | 0 | 0 | 0 |
| 22.08.2023 10:00 - 11:00 | 0 | 0 | 0 | 0 |
| 22.08.2023 11:00 - 12:00 | 0 | 0 | 0 | 0 |
| 22.08.2023 12:00 - 13:00 | 0 | 0 | 0 | 0 |
| 22.08.2023 13:00 - 14:00 | 0 | 0 | 0 | 0 |
| 22.08.2023 14:00 - 15:00 | 0 | 0 | 0 | 0 |
| 22.08.2023 15:00 - 16:00 | 0 | 0 | 0 | 0 |
| 22.08.2023 16:00 - 17:00 | 0 | 0 | 0 | 0 |
| 22.08.2023 17:00 - 18:00 | 0 | 0 | 0 | 0 |
| 22.08.2023 18:00 - 19:00 | 0 | 0 | 0 | 0 |
| 22.08.2023 19:00 - 20:00 | 0 | 0 | 0 | 0 |
| 22.08.2023 20:00 - 21:00 | 0 | 0 | 0 | 0 |
| 22.08.2023 21:00 - 22:00 | 0 | 0 | 0 | 0 |
| 22.08.2023 22:00 - 23:00 | 0 | 0 | 0 | 0 |
| 22.08.2023 23:00 - 24:00 | 0 | 0 | 0 | 0 |
| 23.08.2023 00:00 - 01:00 | 0 | 0 | 0 | 0 |
| 23.08.2023 01:00 - 02:00 | 0 | 0 | 0 | 0 |
| 23.08.2023 02:00 - 03:00 | 0 | 0 | 0 | 0 |
| 23.08.2023 03:00 - 04:00 | 0 | 0 | 0 | 0 |
| 23.08.2023 04:00 - 05:00 | 0 | 0 | 0 | 0 |
| 23.08.2023 05:00 - 06:00 | 0 | 0 | 0 | 0 |
| 23.08.2023 06:00 - 07:00 | 0 | 0 | 0 | 0 |
| 23.08.2023 07:00 - 08:00 | 0 | 0 | 0 | 0 |
| 23.08.2023 08:00 - 09:00 | 0 | 0 | 0 | 0 |
| 23.08.2023 09:00 - 10:00 | 0 | 0 | 0 | 0 |
| 23.08.2023 10:00 - 11:00 | 0 | 0 | 0 | 0 |
| 23.08.2023 11:00 - 12:00 | 0 | 0 | 0 | 0 |
| 23.08.2023 12:00 - 13:00 | 0 | 0 | 0 | 0 |
| 23.08.2023 13:00 - 14:00 | 0 | 0 | 0 | 0 |
| 23.08.2023 14:00 - 15:00 | 0 | 0 | 0 | 0 |
| 23.08.2023 15:00 - 16:00 | 0 | 0 | 0 | 0 |
| 23.08.2023 16:00 - 17:00 | 0 | 0 | 0 | 0 |
| 23.08.2023 17:00 - 18:00 | 0 | 0 | 0 | 0 |
| 23.08.2023 18:00 - 19:00 | 0 | 0 | 0 | 0 |
| 23.08.2023 19:00 - 20:00 | 0 | 0 | 0 | 0 |
| 23.08.2023 20:00 - 21:00 | 0 | 0 | 0 | 0 |
| 23.08.2023 21:00 - 22:00 | 0 | 0 | 0 | 0 |
| 23.08.2023 22:00 - 23:00 | 0 | 0 | 0 | 0 |
| 23.08.2023 23:00 - 24:00 | 0 | 0 | 0 | 0 |
| 24.08.2023 00:00 - 01:00 | 0 | 0 | 0 | 0 |
| 24.08.2023 01:00 - 02:00 | 0 | 0 | 0 | 0 |
| 24.08.2023 02:00 - 03:00 | 0 | 0 | 0 | 0 |
| 24.08.2023 03:00 - 04:00 | 0 | 0 | 0 | 0 |
| 24.08.2023 04:00 - 05:00 | 0 | 0 | 0 | 0 |
| 24.08.2023 05:00 - 06:00 | 0 | 0 | 0 | 0 |
| 24.08.2023 06:00 - 07:00 | 0 | 0 | 0 | 0 |
| 24.08.2023 07:00 - 08:00 | 0 | 0 | 0 | 0 |
| 24.08.2023 08:00 - 09:00 | 0 | 0 | 0 | 0 |
| 24.08.2023 09:00 - 10:00 | 0 | 0 | 0 | 0 |
| 24.08.2023 10:00 - 11:00 | 0 | 0 | 0 | 0 |
| 24.08.2023 11:00 - 12:00 | 0 | 0 | 0 | 0 |
| 24.08.2023 12:00 - 13:00 | 0 | 0 | 0 | 0 |
| 24.08.2023 13:00 - 14:00 | 0 | 0 | 0 | 0 |
| 24.08.2023 14:00 - 15:00 | 0 | 0 | 0 | 0 |
| 24.08.2023 15:00 - 16:00 | 0 | 0 | 0 | 0 |
| 24.08.2023 16:00 - 17:00 | 0 | 0 | 0 | 0 |
| 24.08.2023 17:00 - 18:00 | 0 | 0 | 0 | 0 |
| 24.08.2023 18:00 - 19:00 | 0 | 0 | 0 | 0 |
| 24.08.2023 19:00 - 20:00 | 0 | 0 | 0 | 0 |
| 24.08.2023 20:00 - 21:00 | 0 | 0 | 0 | 0 |
| 24.08.2023 21:00 - 22:00 | 0 | 0 | 0 | 0 |
| 24.08.2023 22:00 - 23:00 | 0 | 0 | 0 | 0 |
| 24.08.2023 23:00 - 24:00 | 0 | 0 | 0 | 0 |
| 25.08.2023 00:00 - 01:00 | 0 | 0 | 0 | 0 |
| 25.08.2023 01:00 - 02:00 | 0 | 0 | 0 | 0 |
| 25.08.2023 02:00 - 03:00 | 0 | 0 | 0 | 0 |
| 25.08.2023 03:00 - 04:00 | 0 | 0 | 0 | 0 |
| 25.08.2023 04:00 - 05:00 | 0 | 0 | 0 | 0 |
| 25.08.2023 05:00 - 06:00 | 0 | 0 | 0 | 0 |
| 25.08.2023 06:00 - 07:00 | 0 | 0 | 0 | 0 |
| 25.08.2023 07:00 - 08:00 | 0 | 0 | 0 | 0 |
| 25.08.2023 08:00 - 09:00 | 0 | 0 | 0 | 0 |
| 25.08.2023 09:00 - 10:00 | 0 | 0 | 0 | 0 |
| 25.08.2023 10:00 - 11:00 | 0 | 0 | 0 | 0 |
| 25.08.2023 11:00 - 12:00 | 0 | 0 | 0 | 0 |
| 25.08.2023 12:00 - 13:00 | 0 | 0 | 0 | 0 |
| 25.08.2023 13:00 - 14:00 | 0 | 0 | 0 | 0 |
| 25.08.2023 14:00 - 15:00 | 0 | 0 | 0 | 0 |
| 25.08.2023 15:00 - 16:00 | 0 | 0 | 0 | 0 |
| 25.08.2023 16:00 - 17:00 | 0 | 0 | 0 | 0 |
| 25.08.2023 17:00 - 18:00 | 0 | 0 | 0 | 0 |
| 25.08.2023 18:00 - 19:00 | 0 | 0 | 0 | 0 |
| 25.08.2023 19:00 - 20:00 | 0 | 0 | 0 | 0 |
| 25.08.2023 20:00 - 21:00 | 0 | 0 | 0 | 0 |
| 25.08.2023 21:00 - 22:00 | 0 | 0 | 0 | 0 |
| 25.08.2023 22:00 - 23:00 | 0 | 0 | 0 | 0 |
| 25.08.2023 23:00 - 24:00 | 0 | 0 | 0 | 0 |
| 26.08.2023 00:00 - 01:00 | 0 | 0 | 0 | 0 |
| 26.08.2023 01:00 - 02:00 | 0 | 0 | 0 | 0 |
| 26.08.2023 02:00 - 03:00 | 0 | 0 | 0 | 0 |
| 26.08.2023 03:00 - 04:00 | 0 | 0 | 0 | 0 |
| 26.08.2023 04:00 - 05:00 | 0 | 0 | 0 | 0 |
| 26.08.2023 05:00 - 06:00 | 0 | 0 | 0 | 0 |
| 26.08.2023 06:00 - 07:00 | 0 | 0 | 0 | 0 |
| 26.08.2023 07:00 - 08:00 | 0 | 0 | 0 | 0 |
| 26.08.2023 08:00 - 09:00 | 0 | 0 | 0 | 0 |
| 26.08.2023 09:00 - 10:00 | 0 | 0 | 0 | 0 |
| 26.08.2023 10:00 - 11:00 | 0 | 0 | 0 | 0 |
| 26.08.2023 11:00 - 12:00 | 0 | 0 | 0 | 0 |
| 26.08.2023 12:00 - 13:00 | 0 | 0 | 0 | 0 |
| 26.08.2023 13:00 - 14:00 | 0 | 0 | 0 | 0 |
| 26.08.2023 14:00 - 15:00 | 0 | 0 | 0 | 0 |
| 26.08.2023 15:00 - 16:00 | 0 | 0 | 0 | 0 |
| 26.08.2023 16:00 - 17:00 | 0 | 0 | 0 | 0 |
| 26.08.2023 17:00 - 18:00 | 0 | 0 | 0 | 0 |
| 26.08.2023 18:00 - 19:00 | 0 | 0 | 0 | 0 |
| 26.08.2023 19:00 - 20:00 | 0 | 0 | 0 | 0 |
| 26.08.2023 20:00 - 21:00 | 0 | 0 | 0 | 0 |
| 26.08.2023 21:00 - 22:00 | 0 | 0 | 0 | 0 |
| 26.08.2023 22:00 - 23:00 | 0 | 0 | 0 | 0 |
| 26.08.2023 23:00 - 24:00 | 0 | 0 | 0 | 0 |
| 27.08.2023 00:00 - 01:00 | 0 | 0 | 0 | 0 |
| 27.08.2023 01:00 - 02:00 | 0 | 0 | 0 | 0 |
| 27.08.2023 02:00 - 03:00 | 0 | 0 | 0 | 0 |
| 27.08.2023 03:00 - 04:00 | 0 | 0 | 0 | 0 |
| 27.08.2023 04:00 - 05:00 | 0 | 0 | 0 | 0 |
| 27.08.2023 05:00 - 06:00 | 0 | 0 | 0 | 0 |
| 27.08.2023 06:00 - 07:00 | 0 | 0 | 0 | 0 |
| 27.08.2023 07:00 - 08:00 | 0 | 0 | 0 | 0 |
| 27.08.2023 08:00 - 09:00 | 0 | 0 | 0 | 0 |
| 27.08.2023 09:00 - 10:00 | 0 | 0 | 0 | 0 |
| 27.08.2023 10:00 - 11:00 | 0 | 0 | 0 | 0 |
| 27.08.2023 11:00 - 12:00 | 0 | 0 | 0 | 0 |
| 27.08.2023 12:00 - 13:00 | 0 | 0 | 0 | 0 |
| 27.08.2023 13:00 - 14:00 | 0 | 0 | 0 | 0 |
| 27.08.2023 14:00 - 15:00 | 0 | 0 | 0 | 0 |
| 27.08.2023 15:00 - 16:00 | 0 | 0 | 0 | 0 |
| 27.08.2023 16:00 - 17:00 | 0 | 0 | 0 | 0 |
| 27.08.2023 17:00 - 18:00 | 0 | 0 | 0 | 0 |
| 27.08.2023 18:00 - 19:00 | 0 | 0 | 0 | 0 |
| 27.08.2023 19:00 - 20:00 | 0 | 0 | 0 | 0 |
| 27.08.2023 20:00 - 21:00 | 0 | 0 | 0 | 0 |
| 27.08.2023 21:00 - 22:00 | 0 | 0 | 0 | 0 |
| 27.08.2023 22:00 - 23:00 | 0 | 0 | 0 | 0 |
| 27.08.2023 23:00 - 24:00 | 0 | 0 | 0 | 0 |
| 28.08.2023 00:00 - 01:00 | 0 | 0 | 0 | 0 |
| 28.08.2023 01:00 - 02:00 | 0 | 0 | 0 | 0 |
| 28.08.2023 02:00 - 03:00 | 50 | 0 | 0 | 0 |
| 28.08.2023 03:00 - 04:00 | 150 | 0 | 0 | 0 |
| 28.08.2023 04:00 - 05:00 | 150 | 0 | 0 | 0 |
| 28.08.2023 05:00 - 06:00 | 150 | 0 | 0 | 0 |
| 28.08.2023 06:00 - 07:00 | 0 | 0 | 0 | 0 |
| 28.08.2023 07:00 - 08:00 | 0 | 0 | 0 | 0 |
| 28.08.2023 08:00 - 09:00 | 0 | 0 | 0 | 0 |
| 28.08.2023 09:00 - 10:00 | 0 | 0 | 0 | 0 |
| 28.08.2023 10:00 - 11:00 | 0 | 0 | 0 | 0 |
| 28.08.2023 11:00 - 12:00 | 0 | 0 | 0 | 0 |
| 28.08.2023 12:00 - 13:00 | 0 | 0 | 0 | 0 |
| 28.08.2023 13:00 - 14:00 | 0 | 0 | 0 | 0 |
| 28.08.2023 14:00 - 15:00 | 0 | 0 | 0 | 0 |
| 28.08.2023 15:00 - 16:00 | 0 | 0 | 0 | 0 |
| 28.08.2023 16:00 - 17:00 | 0 | 0 | 0 | 0 |
| 28.08.2023 17:00 - 18:00 | 0 | 0 | 0 | 0 |
| 28.08.2023 18:00 - 19:00 | 0 | 0 | 0 | 0 |
| 28.08.2023 19:00 - 20:00 | 0 | 0 | 0 | 0 |
| 28.08.2023 20:00 - 21:00 | 0 | 0 | 0 | 0 |
| 28.08.2023 21:00 - 22:00 | 0 | 0 | 0 | 0 |
| 28.08.2023 22:00 - 23:00 | 0 | 0 | 0 | 0 |
| 28.08.2023 23:00 - 24:00 | 0 | 0 | 0 | 0 |
| 29.08.2023 00:00 - 01:00 | 0 | 0 | 0 | 0 |
| 29.08.2023 01:00 - 02:00 | 0 | 0 | 0 | 0 |
| 29.08.2023 02:00 - 03:00 | 0 | 0 | 0 | 0 |
| 29.08.2023 03:00 - 04:00 | 0 | 0 | 0 | 0 |
| 29.08.2023 04:00 - 05:00 | 0 | 0 | 0 | 0 |
| 29.08.2023 05:00 - 06:00 | 0 | 0 | 0 | 0 |
| 29.08.2023 06:00 - 07:00 | 0 | 0 | 0 | 0 |
| 29.08.2023 07:00 - 08:00 | 0 | 0 | 0 | 0 |
| 29.08.2023 08:00 - 09:00 | 0 | 0 | 0 | 0 |
| 29.08.2023 09:00 - 10:00 | 0 | 0 | 0 | 0 |
| 29.08.2023 10:00 - 11:00 | 0 | 0 | 0 | 0 |
| 29.08.2023 11:00 - 12:00 | 0 | 0 | 0 | 0 |
| 29.08.2023 12:00 - 13:00 | 0 | 0 | 0 | 0 |
| 29.08.2023 13:00 - 14:00 | 0 | 0 | 0 | 0 |
| 29.08.2023 14:00 - 15:00 | 0 | 0 | 0 | 0 |
| 29.08.2023 15:00 - 16:00 | 0 | 0 | 0 | 0 |
| 29.08.2023 16:00 - 17:00 | 0 | 0 | 0 | 0 |
| 29.08.2023 17:00 - 18:00 | 0 | 0 | 0 | 0 |
| 29.08.2023 18:00 - 19:00 | 0 | 0 | 0 | 0 |
| 29.08.2023 19:00 - 20:00 | 0 | 0 | 0 | 0 |
| 29.08.2023 20:00 - 21:00 | 0 | 0 | 0 | 0 |
| 29.08.2023 21:00 - 22:00 | 0 | 0 | 0 | 0 |
| 29.08.2023 22:00 - 23:00 | 0 | 0 | 0 | 0 |
| 29.08.2023 23:00 - 24:00 | 0 | 0 | 0 | 0 |
| 30.08.2023 00:00 - 01:00 | 0 | 0 | 0 | 0 |
| 30.08.2023 01:00 - 02:00 | 0 | 0 | 0 | 0 |
| 30.08.2023 02:00 - 03:00 | 0 | 0 | 0 | 0 |
| 30.08.2023 03:00 - 04:00 | 0 | 0 | 0 | 0 |
| 30.08.2023 04:00 - 05:00 | 0 | 0 | 0 | 0 |
| 30.08.2023 05:00 - 06:00 | 0 | 0 | 0 | 0 |
| 30.08.2023 06:00 - 07:00 | 0 | 0 | 0 | 0 |
| 30.08.2023 07:00 - 08:00 | 0 | 0 | 0 | 0 |
| 30.08.2023 08:00 - 09:00 | 0 | 0 | 0 | 0 |
| 30.08.2023 09:00 - 10:00 | 0 | 0 | 0 | 0 |
| 30.08.2023 10:00 - 11:00 | 0 | 0 | 0 | 0 |
| 30.08.2023 11:00 - 12:00 | 0 | 0 | 0 | 0 |
| 30.08.2023 12:00 - 13:00 | 0 | 0 | 0 | 0 |
| 30.08.2023 13:00 - 14:00 | 0 | 0 | 0 | 0 |
| 30.08.2023 14:00 - 15:00 | 0 | 0 | 0 | 0 |
| 30.08.2023 15:00 - 16:00 | 0 | 0 | 0 | 0 |
| 30.08.2023 16:00 - 17:00 | 0 | 0 | 0 | 0 |
| 30.08.2023 17:00 - 18:00 | 0 | 0 | 0 | 0 |
| 30.08.2023 18:00 - 19:00 | 0 | 0 | 0 | 0 |
| 30.08.2023 19:00 - 20:00 | 0 | 0 | 0 | 0 |
| 30.08.2023 20:00 - 21:00 | 0 | 0 | 0 | 0 |
| 30.08.2023 21:00 - 22:00 | 0 | 0 | 0 | 0 |
| 30.08.2023 22:00 - 23:00 | 0 | 0 | 0 | 0 |
| 30.08.2023 23:00 - 24:00 | 0 | 0 | 0 | 0 |
| 31.08.2023 00:00 - 01:00 | 0 | 0 | 0 | 0 |
| 31.08.2023 01:00 - 02:00 | 0 | 0 | 0 | 0 |
| 31.08.2023 02:00 - 03:00 | 0 | 0 | 0 | 0 |
| 31.08.2023 03:00 - 04:00 | 0 | 0 | 0 | 0 |
| 31.08.2023 04:00 - 05:00 | 0 | 0 | 0 | 0 |
| 31.08.2023 05:00 - 06:00 | 0 | 0 | 0 | 0 |
| 31.08.2023 06:00 - 07:00 | 0 | 0 | 0 | 0 |
| 31.08.2023 07:00 - 08:00 | 0 | 0 | 0 | 0 |
| 31.08.2023 08:00 - 09:00 | 0 | 0 | 0 | 0 |
| 31.08.2023 09:00 - 10:00 | 0 | 0 | 0 | 0 |
| 31.08.2023 10:00 - 11:00 | 0 | 0 | 0 | 0 |
| 31.08.2023 11:00 - 12:00 | 0 | 0 | 0 | 0 |
| 31.08.2023 12:00 - 13:00 | 0 | 0 | 0 | 0 |
| 31.08.2023 13:00 - 14:00 | 0 | 0 | 0 | 0 |
| 31.08.2023 14:00 - 15:00 | 0 | 0 | 0 | 0 |
| 31.08.2023 15:00 - 16:00 | 0 | 0 | 0 | 0 |
| 31.08.2023 16:00 - 17:00 | 0 | 0 | 0 | 0 |
| 31.08.2023 17:00 - 18:00 | 0 | 0 | 0 | 0 |
| 31.08.2023 18:00 - 19:00 | 0 | 0 | 0 | 0 |
| 31.08.2023 19:00 - 20:00 | 0 | 0 | 0 | 0 |
| 31.08.2023 20:00 - 21:00 | 0 | 0 | 0 | 0 |
| 31.08.2023 21:00 - 22:00 | 0 | 0 | 0 | 0 |
| 31.08.2023 22:00 - 23:00 | 0 | 0 | 0 | 0 |
| 31.08.2023 23:00 - 24:00 | 0 | 0 | 0 | 0 |
| 01.09.2023 00:00 - 01:00 | 0 | 0 | 0 | 0 |
| 01.09.2023 01:00 - 02:00 | 0 | 0 | 0 | 0 |
| 01.09.2023 02:00 - 03:00 | 0 | 0 | 0 | 0 |
| 01.09.2023 03:00 - 04:00 | 0 | 0 | 0 | 0 |
| 01.09.2023 04:00 - 05:00 | 0 | 0 | 0 | 0 |
| 01.09.2023 05:00 - 06:00 | 0 | 0 | 0 | 0 |